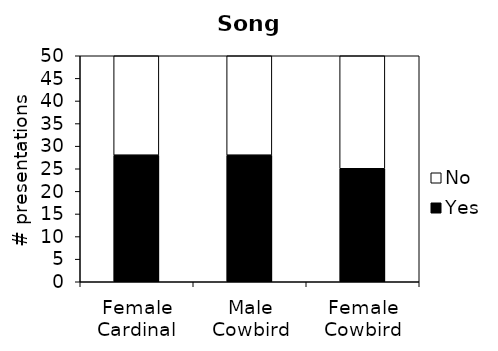
| Category | Yes | No |
|---|---|---|
| Female Cardinal | 28 | 22 |
| Male Cowbird | 28 | 22 |
| Female Cowbird | 25 | 25 |